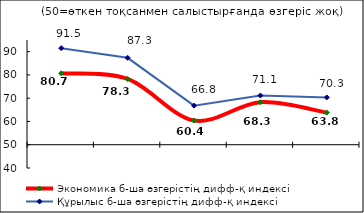
| Category | Экономика б-ша өзгерістің дифф-қ индексі | Құрылыс б-ша өзгерістің дифф-қ индексі |
|---|---|---|
| 0 | 80.69 | 91.49 |
| 1 | 78.275 | 87.345 |
| 2 | 60.405 | 66.8 |
| 3 | 68.29 | 71.145 |
| 4 | 63.81 | 70.325 |